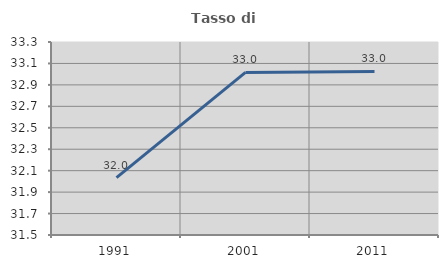
| Category | Tasso di occupazione   |
|---|---|
| 1991.0 | 32.035 |
| 2001.0 | 33.016 |
| 2011.0 | 33.026 |